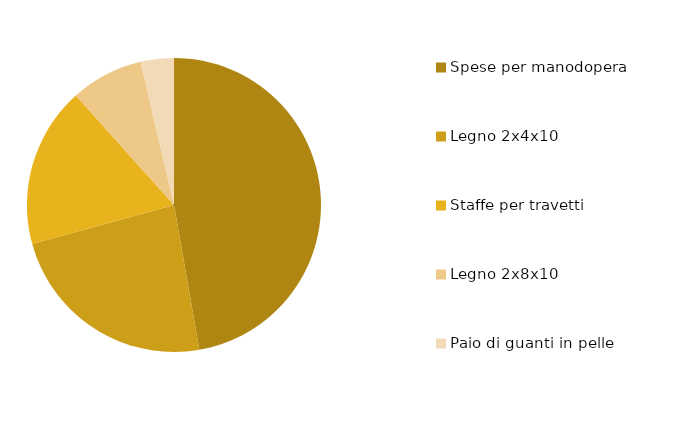
| Category | Series 0 |
|---|---|
| Spese per manodopera | 200 |
| Legno 2x4x10 | 99.4 |
| Staffe per travetti | 74.7 |
| Legno 2x8x10 | 33.75 |
| Paio di guanti in pelle | 15.5 |